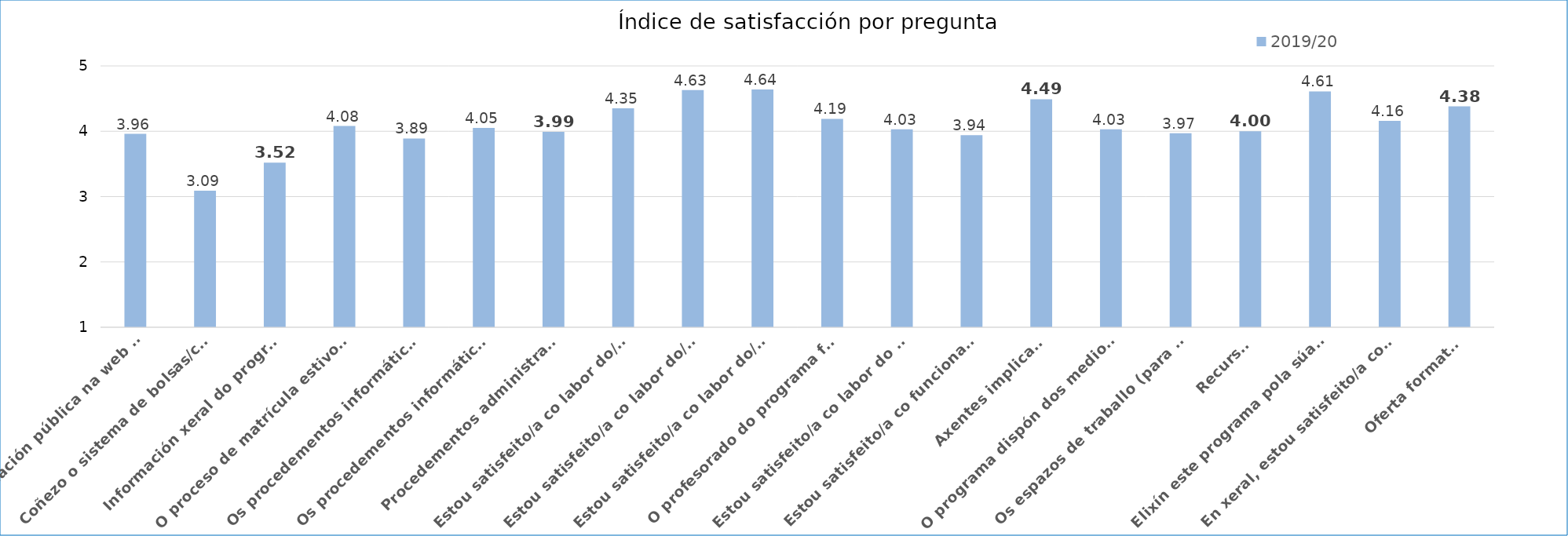
| Category | 2019/20 |
|---|---|
| A información pública na web sobre o programa (obxectivos, requisitos formativos, cadro docente, liñas de investigación) foi satisfactoria. | 3.96 |
| Coñezo o sistema de bolsas/contratos para o alumnado de doutoramento (etapa de formación, mobilidade). | 3.09 |
| Información xeral do programa | 3.52 |
| O proceso de matrícula estivo ben organizado. | 4.08 |
| Os procedementos informáticos relativos á proposta e aprobación dos documentos de actividades formativas foron satisfactorios. | 3.89 |
| Os procedementos informáticos relativos á proposta e aprobación dos plans de investigación foron satisfactorios. | 4.05 |
| Procedementos administrativos | 3.99 |
| Estou satisfeito/a co labor do/a coordinador/a do programa. | 4.35 |
| Estou satisfeito/a co labor do/a meu/miña titor/a. | 4.63 |
| Estou satisfeito/a co labor do/a/s meu/miña/s director/a/s de tese. | 4.64 |
| O profesorado do programa fomenta a crítica científica e maila actividade investigadora. | 4.19 |
| Estou satisfeito/a co labor do personal administrativo do Centro (Facultade, Escola). | 4.03 |
| Estou satisfeito/a co funcionamento da Sección de Posgrao da UVigo. | 3.94 |
| Axentes implicados | 4.49 |
| O programa dispón dos medios materiais, bibliográficos e de investigación necesarios para o desenvolvemento satisfactorio da miña tese. | 4.03 |
| Os espazos de traballo (para doutorandos/as, biblioteca, laboratorios, etc.) son axeitados. | 3.97 |
| Recursos | 4 |
| Elixín este programa pola súa relación cos meu obxectivos profesionais. | 4.61 |
| En xeral, estou satisfeito/a co programa de doutoramento. | 4.16 |
|  Oferta formativa | 4.38 |